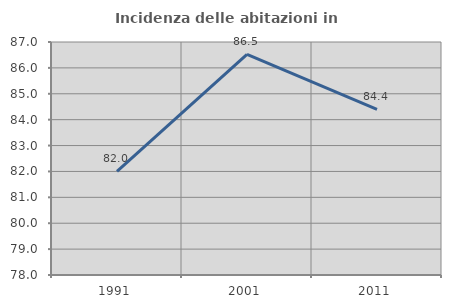
| Category | Incidenza delle abitazioni in proprietà  |
|---|---|
| 1991.0 | 82 |
| 2001.0 | 86.525 |
| 2011.0 | 84.397 |